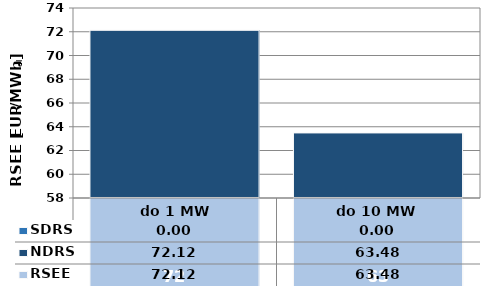
| Category | NDRS | SDRS |
|---|---|---|
|  do 1 MW | 72.12 | 0 |
| do 10 MW | 63.48 | 0 |